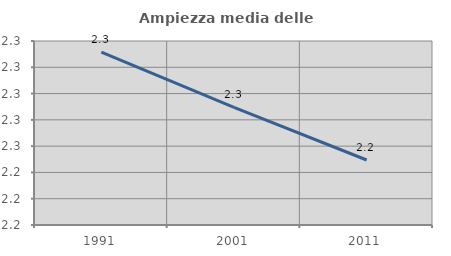
| Category | Ampiezza media delle famiglie |
|---|---|
| 1991.0 | 2.332 |
| 2001.0 | 2.289 |
| 2011.0 | 2.249 |